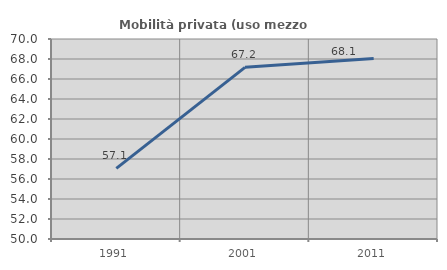
| Category | Mobilità privata (uso mezzo privato) |
|---|---|
| 1991.0 | 57.06 |
| 2001.0 | 67.164 |
| 2011.0 | 68.058 |